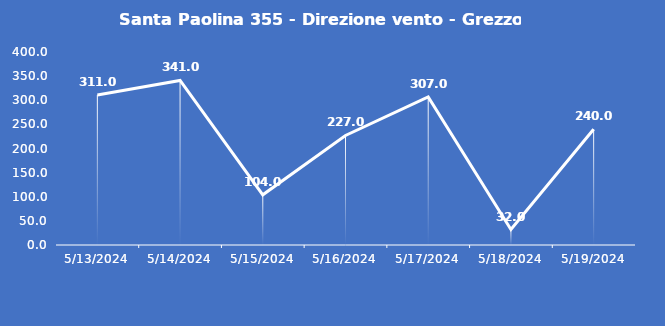
| Category | Santa Paolina 355 - Direzione vento - Grezzo (°N) |
|---|---|
| 5/13/24 | 311 |
| 5/14/24 | 341 |
| 5/15/24 | 104 |
| 5/16/24 | 227 |
| 5/17/24 | 307 |
| 5/18/24 | 32 |
| 5/19/24 | 240 |